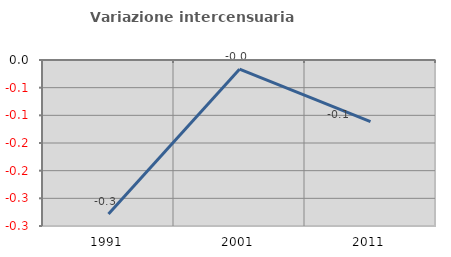
| Category | Variazione intercensuaria annua |
|---|---|
| 1991.0 | -0.278 |
| 2001.0 | -0.017 |
| 2011.0 | -0.112 |